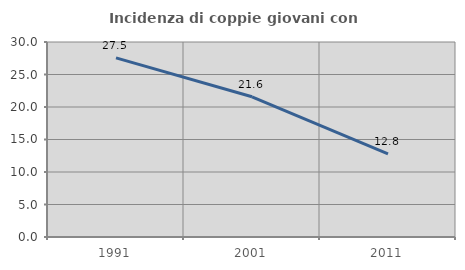
| Category | Incidenza di coppie giovani con figli |
|---|---|
| 1991.0 | 27.55 |
| 2001.0 | 21.575 |
| 2011.0 | 12.771 |